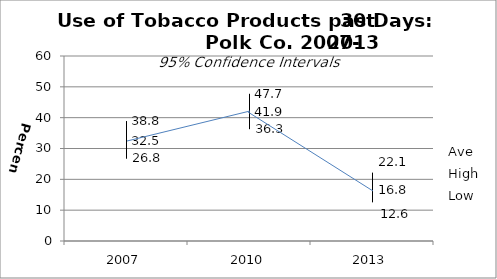
| Category | Ave | High | Low |
|---|---|---|---|
| 2007.0 | 32.5 | 38.8 | 26.8 |
| 2010.0 | 41.9 | 47.7 | 36.3 |
| 2013.0 | 16.8 | 22.1 | 12.6 |